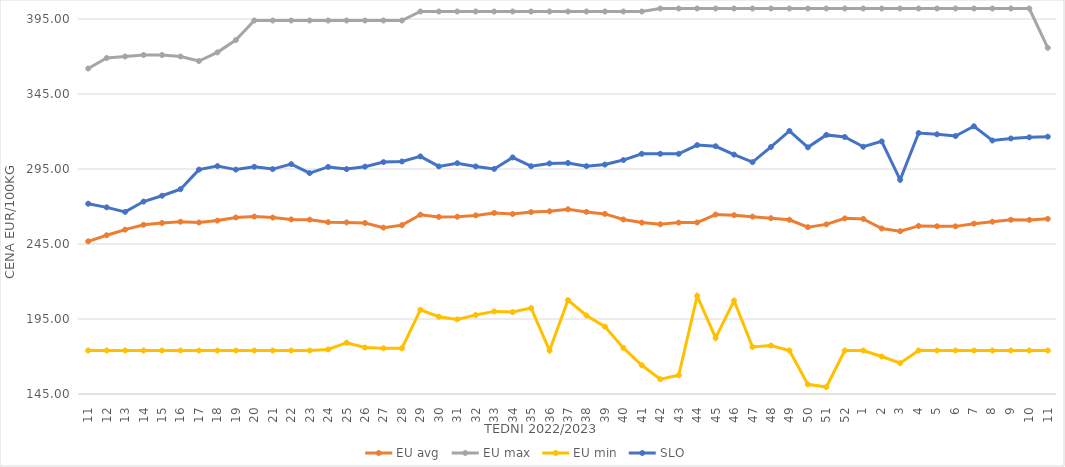
| Category | EU avg | EU max | EU min | SLO |
|---|---|---|---|---|
| 11.0 | 246.762 | 362 | 174 | 271.86 |
| 12.0 | 250.845 | 369 | 174 | 269.43 |
| 13.0 | 254.568 | 370 | 174 | 266.39 |
| 14.0 | 257.819 | 371 | 174 | 273.3 |
| 15.0 | 259 | 371 | 174 | 277.18 |
| 16.0 | 259.873 | 370 | 174 | 281.55 |
| 17.0 | 259.351 | 367 | 174 | 294.59 |
| 18.0 | 260.6 | 372.758 | 174 | 296.93 |
| 19.0 | 262.669 | 381 | 174 | 294.6 |
| 20.0 | 263.291 | 394 | 174 | 296.48 |
| 21.0 | 262.64 | 394 | 174 | 294.94 |
| 22.0 | 261.388 | 394 | 174 | 298.26 |
| 23.0 | 261.228 | 394 | 174 | 292.27 |
| 24.0 | 259.544 | 394 | 174.72 | 296.39 |
| 25.0 | 259.395 | 394 | 179.2 | 294.93 |
| 26.0 | 259.018 | 394 | 176 | 296.56 |
| 27.0 | 255.922 | 394 | 175.451 | 299.59 |
| 28.0 | 257.564 | 394 | 175.52 | 300.01 |
| 29.0 | 264.52 | 400 | 201.097 | 303.41 |
| 30.0 | 263.067 | 400 | 196.496 | 296.73 |
| 31.0 | 263.196 | 400 | 194.756 | 298.88 |
| 32.0 | 264.059 | 400 | 197.634 | 296.7 |
| 33.0 | 265.729 | 400 | 200.07 | 295.05 |
| 34.0 | 265.016 | 400 | 199.637 | 302.73 |
| 35.0 | 266.273 | 400 | 202.277 | 296.86 |
| 36.0 | 266.807 | 400 | 174 | 298.7 |
| 37.0 | 268.136 | 400 | 207.594 | 299.02 |
| 38.0 | 266.39 | 400 | 197.352 | 296.91 |
| 39.0 | 265.059 | 400 | 189.926 | 297.96 |
| 40.0 | 261.35 | 400 | 175.723 | 300.95 |
| 41.0 | 259.271 | 400 | 164.165 | 305.13 |
| 42.0 | 258.146 | 402 | 154.869 | 305.13 |
| 43.0 | 259.256 | 402 | 157.459 | 305.13 |
| 44.0 | 259.32 | 402 | 210.415 | 310.93 |
| 45.0 | 264.649 | 402 | 182.35 | 310.16 |
| 46.0 | 264.228 | 402 | 207.247 | 304.58 |
| 47.0 | 263.24 | 402 | 176.378 | 299.59 |
| 48.0 | 262.225 | 402 | 177.332 | 309.69 |
| 49.0 | 261.152 | 402 | 174 | 320.38 |
| 50.0 | 256.24 | 402 | 151.434 | 309.44 |
| 51.0 | 258.071 | 402 | 149.638 | 317.74 |
| 52.0 | 262.088 | 402 | 174 | 316.36 |
| 1.0 | 261.716 | 402 | 174 | 309.84 |
| 2.0 | 255.331 | 402 | 169.983 | 313.4 |
| 3.0 | 253.546 | 402 | 165.574 | 287.81 |
| 4.0 | 257.051 | 402 | 174 | 318.98 |
| 5.0 | 256.808 | 402 | 174 | 318.13 |
| 6.0 | 256.75 | 402 | 174 | 316.99 |
| 7.0 | 258.565 | 402 | 174 | 323.47 |
| 8.0 | 259.872 | 402 | 174 | 314 |
| 9.0 | 261.166 | 402 | 174 | 315.35 |
| 10.0 | 261.061 | 402 | 174 | 316.13 |
| 11.0 | 261.769 | 375.79 | 174 | 316.55 |